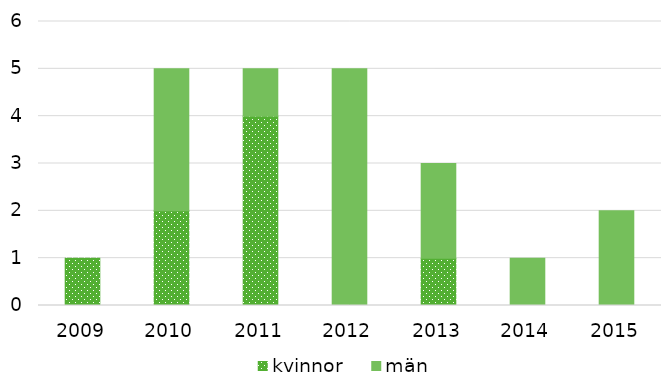
| Category | kvinnor | män |
|---|---|---|
| 2009.0 | 1 | 0 |
| 2010.0 | 2 | 3 |
| 2011.0 | 4 | 1 |
| 2012.0 | 0 | 5 |
| 2013.0 | 1 | 2 |
| 2014.0 | 0 | 1 |
| 2015.0 | 0 | 2 |